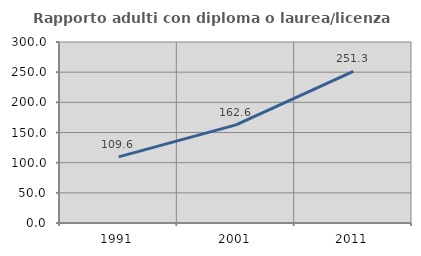
| Category | Rapporto adulti con diploma o laurea/licenza media  |
|---|---|
| 1991.0 | 109.639 |
| 2001.0 | 162.591 |
| 2011.0 | 251.314 |